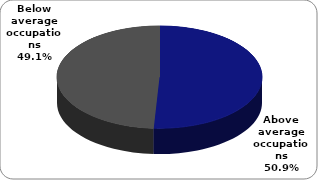
| Category | Series 0 |
|---|---|
| Above average occupations | 0.509 |
| Below average occupations | 0.491 |